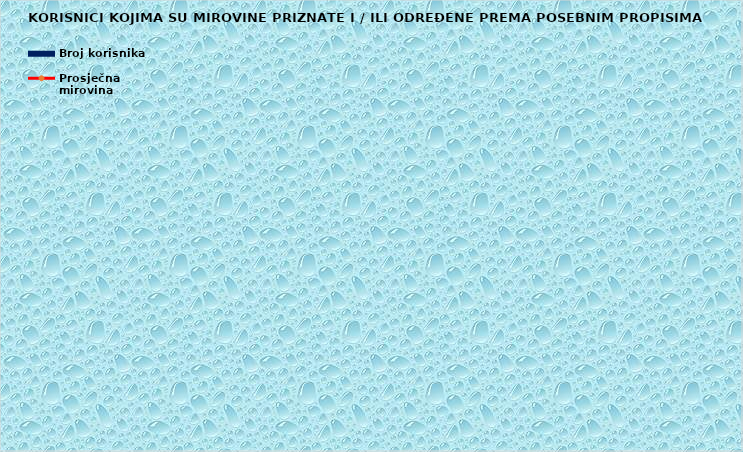
| Category | Broj korisnika |
|---|---|
|      a) radnici na poslovima ovlaštenih službenih osoba u tijelima unutarnjih 
poslova i pravosuđa, kojima je pravo na mirovinu priznato prema propisima
koji su bili na snazi do stupanja na snagu Zakona o pravima iz mirovinskog
osiguranja DVO, PS i OSO | 8014 |
|      b) radnici na  poslovima policijskih službenika, ovlaštenih službenih osoba pravosuđa i službene osobe s posebnim dužnostima i ovlastima u sigurnosno obavještajnom sustavu RH koji su pravo na mirovinu ostvarili prema Zakonu o pravima DVO, PS i OSO | 8879 |
|      c) radnici na poslovima razminiranja | 606 |
| Korisnici koji pravo na mirovinu ostvaruju prema Zakonu o vatrogastvu (NN 125/19)* | 133 |
| Djelatne vojne osobe - DVO  | 15863 |
| Pripadnici Hrvatske domovinske vojske od 1941. do 1945. godine | 3016 |
| Bivši politički zatvorenici | 2511 |
| Hrvatski branitelji iz Domovinskog rata - ZOHBDR | 70835 |
| Mirovine priznate prema općim propisima, a određene prema
ZOHBDR - u iz 2017. (čl. 27., 35., 48. i 49. stavak 2.)  | 48433 |
| Pripadnici bivše Jugoslavenske narodne armije - JNA | 4668 |
| Pripadnici bivše Jugoslavenske narodne armije - JNA - čl. 185 ZOMO | 159 |
| Sudionici Narodnooslobodilačkog rata - NOR | 7483 |
| Zastupnici u Hrvatskom saboru, članovi Vlade, suci Ustavnog suda i glavni državni revizor  | 686 |
| Članovi Izvršnog vijeća Sabora, Saveznog izvršnog vijeća i administrativno umirovljeni javni službenici | 80 |
| Bivši službenici u saveznim tijelima bivše SFRJ - članak 38. ZOMO | 29 |
| Redoviti članovi Hrvatske akademije znanosti i umjetnosti - HAZU | 131 |
| Radnici u Istarskim ugljenokopima "Tupljak" d.d. Labin  | 248 |
| Radnici profesionalno izloženi azbestu | 857 |
| Osiguranici - članovi posade broda u međunarodnoj plovidbi i nacionalnoj plovidbi - članak 129. a stavak 2. Pomorskog zakonika | 196 |
| Pripadnici Hrvatskog vijeća obrane  - HVO  | 6749 |